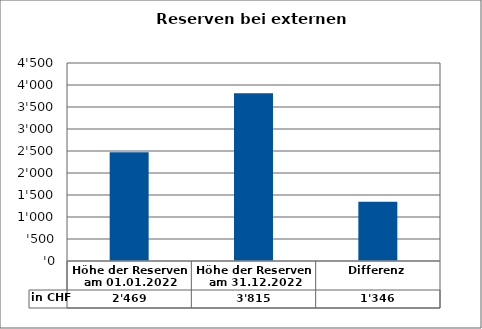
| Category | in CHF |
|---|---|
| Höhe der Reserven am 01.01.2022 | 2469.23 |
| Höhe der Reserven am 31.12.2022 | 3815.05 |
| Differenz | 1345.82 |